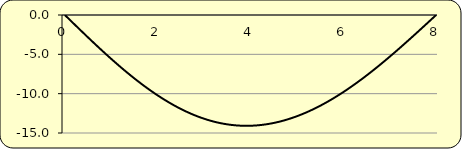
| Category | deflection |
|---|---|
| 0.0 | 0 |
| 0.08 | -0.46 |
| 0.16 | -0.92 |
| 0.24 | -1.378 |
| 0.32 | -1.835 |
| 0.4 | -2.29 |
| 0.48000000000000004 | -2.742 |
| 0.56 | -3.191 |
| 0.64 | -3.637 |
| 0.72 | -4.078 |
| 0.7999999999999999 | -4.515 |
| 0.8799999999999999 | -4.946 |
| 0.9599999999999999 | -5.373 |
| 1.0399999999999998 | -5.793 |
| 1.1199999999999999 | -6.207 |
| 1.2 | -6.614 |
| 1.28 | -7.013 |
| 1.36 | -7.405 |
| 1.4400000000000002 | -7.789 |
| 1.5200000000000002 | -8.165 |
| 1.6000000000000003 | -8.531 |
| 1.6800000000000004 | -8.889 |
| 1.7600000000000005 | -9.236 |
| 1.8400000000000005 | -9.574 |
| 1.9200000000000006 | -9.902 |
| 2.0000000000000004 | -10.219 |
| 2.0800000000000005 | -10.526 |
| 2.1600000000000006 | -10.821 |
| 2.2400000000000007 | -11.105 |
| 2.3200000000000007 | -11.377 |
| 2.400000000000001 | -11.637 |
| 2.480000000000001 | -11.885 |
| 2.560000000000001 | -12.121 |
| 2.640000000000001 | -12.344 |
| 2.720000000000001 | -12.554 |
| 2.800000000000001 | -12.752 |
| 2.8800000000000012 | -12.936 |
| 2.9600000000000013 | -13.107 |
| 3.0400000000000014 | -13.264 |
| 3.1200000000000014 | -13.407 |
| 3.2000000000000015 | -13.537 |
| 3.2800000000000016 | -13.653 |
| 3.3600000000000017 | -13.756 |
| 3.4400000000000017 | -13.844 |
| 3.520000000000002 | -13.919 |
| 3.600000000000002 | -13.98 |
| 3.680000000000002 | -14.027 |
| 3.760000000000002 | -14.06 |
| 3.840000000000002 | -14.08 |
| 3.920000000000002 | -14.086 |
| 4.000000000000002 | -14.078 |
| 4.080000000000002 | -14.057 |
| 4.160000000000002 | -14.022 |
| 4.240000000000002 | -13.974 |
| 4.320000000000002 | -13.912 |
| 4.400000000000002 | -13.837 |
| 4.480000000000002 | -13.749 |
| 4.560000000000002 | -13.649 |
| 4.640000000000002 | -13.535 |
| 4.720000000000002 | -13.408 |
| 4.8000000000000025 | -13.269 |
| 4.880000000000003 | -13.118 |
| 4.960000000000003 | -12.954 |
| 5.040000000000003 | -12.779 |
| 5.120000000000003 | -12.591 |
| 5.200000000000003 | -12.391 |
| 5.280000000000003 | -12.18 |
| 5.360000000000003 | -11.958 |
| 5.440000000000003 | -11.724 |
| 5.520000000000003 | -11.48 |
| 5.600000000000003 | -11.225 |
| 5.680000000000003 | -10.959 |
| 5.760000000000003 | -10.683 |
| 5.840000000000003 | -10.397 |
| 5.9200000000000035 | -10.101 |
| 6.0000000000000036 | -9.796 |
| 6.080000000000004 | -9.482 |
| 6.160000000000004 | -9.158 |
| 6.240000000000004 | -8.826 |
| 6.320000000000004 | -8.486 |
| 6.400000000000004 | -8.137 |
| 6.480000000000004 | -7.781 |
| 6.560000000000004 | -7.417 |
| 6.640000000000004 | -7.047 |
| 6.720000000000004 | -6.669 |
| 6.800000000000004 | -6.285 |
| 6.880000000000004 | -5.894 |
| 6.960000000000004 | -5.498 |
| 7.0400000000000045 | -5.097 |
| 7.1200000000000045 | -4.691 |
| 7.200000000000005 | -4.279 |
| 7.280000000000005 | -3.864 |
| 7.360000000000005 | -3.445 |
| 7.440000000000005 | -3.022 |
| 7.520000000000005 | -2.596 |
| 7.600000000000005 | -2.167 |
| 7.680000000000005 | -1.737 |
| 7.760000000000005 | -1.304 |
| 7.840000000000005 | -0.87 |
| 7.920000000000005 | -0.435 |
| 8.000000000000005 | 0 |